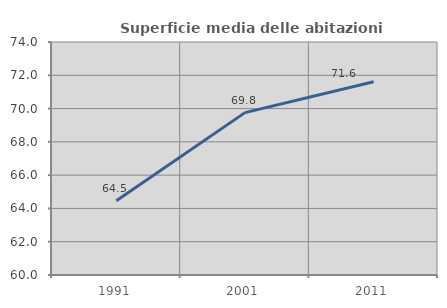
| Category | Superficie media delle abitazioni occupate |
|---|---|
| 1991.0 | 64.462 |
| 2001.0 | 69.756 |
| 2011.0 | 71.615 |